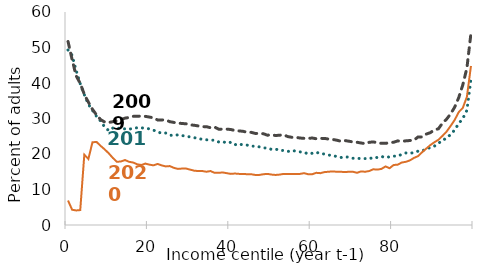
| Category | 2019 | 2009 | 2020 |
|---|---|---|---|
| 0.0 | 49.3 | 51.7 | 6.9 |
| 1.0 | 47.8 | 46.6 | 4.3 |
| 2.0 | 43.5 | 42 | 4.1 |
| 3.0 | 39.8 | 39.9 | 4.2 |
| 4.0 | 36.7 | 36.8 | 19.8 |
| 5.0 | 34 | 34.6 | 18.6 |
| 6.0 | 32.3 | 32.6 | 23.3 |
| 7.0 | 30.6 | 31 | 23.4 |
| 8.0 | 29.3 | 29.7 | 22.3 |
| 9.0 | 27.6 | 29 | 21.3 |
| 10.0 | 26.6 | 28.9 | 20.2 |
| 11.0 | 27.3 | 29.1 | 18.9 |
| 12.0 | 27.4 | 29.4 | 17.8 |
| 13.0 | 27 | 29.7 | 17.9 |
| 14.0 | 27.1 | 30.1 | 18.3 |
| 15.0 | 27 | 30.3 | 17.8 |
| 16.0 | 27.2 | 30.6 | 17.6 |
| 17.0 | 27.4 | 30.6 | 17.1 |
| 18.0 | 27.4 | 30.7 | 16.9 |
| 19.0 | 27.2 | 30.6 | 17.3 |
| 20.0 | 27.1 | 30.4 | 17 |
| 21.0 | 26.7 | 30.2 | 16.8 |
| 22.0 | 26.3 | 29.6 | 17.2 |
| 23.0 | 25.8 | 29.6 | 16.8 |
| 24.0 | 25.9 | 29.6 | 16.5 |
| 25.0 | 25.3 | 29.1 | 16.6 |
| 26.0 | 25.2 | 28.9 | 16.1 |
| 27.0 | 25.4 | 28.7 | 15.8 |
| 28.0 | 25.2 | 28.6 | 15.9 |
| 29.0 | 25 | 28.5 | 15.9 |
| 30.0 | 24.8 | 28.2 | 15.6 |
| 31.0 | 24.6 | 28.1 | 15.3 |
| 32.0 | 24.4 | 27.9 | 15.2 |
| 33.0 | 24.1 | 27.7 | 15.2 |
| 34.0 | 24 | 27.7 | 15 |
| 35.0 | 23.9 | 27.4 | 15.2 |
| 36.0 | 23.9 | 27.6 | 14.7 |
| 37.0 | 23.4 | 27 | 14.7 |
| 38.0 | 23.5 | 27 | 14.8 |
| 39.0 | 23.1 | 27 | 14.6 |
| 40.0 | 23.3 | 26.9 | 14.4 |
| 41.0 | 22.6 | 26.6 | 14.5 |
| 42.0 | 22.9 | 26.5 | 14.4 |
| 43.0 | 22.5 | 26.4 | 14.4 |
| 44.0 | 22.5 | 26.1 | 14.3 |
| 45.0 | 22.2 | 26.1 | 14.3 |
| 46.0 | 22.2 | 25.8 | 14.1 |
| 47.0 | 22 | 25.8 | 14.1 |
| 48.0 | 21.7 | 25.7 | 14.3 |
| 49.0 | 21.7 | 25.3 | 14.4 |
| 50.0 | 21.3 | 25.4 | 14.2 |
| 51.0 | 21.4 | 25.2 | 14.1 |
| 52.0 | 21 | 25.3 | 14.2 |
| 53.0 | 21 | 25.4 | 14.4 |
| 54.0 | 20.7 | 24.9 | 14.4 |
| 55.0 | 21 | 24.7 | 14.4 |
| 56.0 | 20.8 | 24.7 | 14.4 |
| 57.0 | 20.6 | 24.5 | 14.4 |
| 58.0 | 20.5 | 24.4 | 14.6 |
| 59.0 | 20 | 24.4 | 14.3 |
| 60.0 | 20.2 | 24.5 | 14.3 |
| 61.0 | 20.5 | 24.3 | 14.7 |
| 62.0 | 20.1 | 24.4 | 14.6 |
| 63.0 | 20 | 24.4 | 14.9 |
| 64.0 | 19.7 | 24.2 | 15 |
| 65.0 | 19.6 | 24.1 | 15.1 |
| 66.0 | 19.3 | 23.9 | 15 |
| 67.0 | 19 | 23.6 | 15 |
| 68.0 | 19.2 | 23.8 | 14.9 |
| 69.0 | 19.1 | 23.6 | 15 |
| 70.0 | 18.8 | 23.4 | 15 |
| 71.0 | 18.8 | 23.3 | 14.7 |
| 72.0 | 18.7 | 23.1 | 15.1 |
| 73.0 | 18.7 | 22.9 | 15 |
| 74.0 | 18.6 | 23.3 | 15.2 |
| 75.0 | 19.1 | 23.4 | 15.7 |
| 76.0 | 19 | 23.2 | 15.6 |
| 77.0 | 19.3 | 23 | 15.8 |
| 78.0 | 19 | 23 | 16.5 |
| 79.0 | 19.2 | 23.2 | 16 |
| 80.0 | 19.4 | 23.3 | 16.9 |
| 81.0 | 19.4 | 23.7 | 17 |
| 82.0 | 19.9 | 23.6 | 17.6 |
| 83.0 | 20.3 | 23.7 | 17.8 |
| 84.0 | 20.2 | 23.8 | 18.2 |
| 85.0 | 20.4 | 23.9 | 18.9 |
| 86.0 | 20.8 | 24.8 | 19.4 |
| 87.0 | 21 | 24.8 | 20.5 |
| 88.0 | 21.2 | 25.6 | 21.5 |
| 89.0 | 21.9 | 26 | 22.5 |
| 90.0 | 22.2 | 26.8 | 23.3 |
| 91.0 | 23.1 | 27.1 | 24 |
| 92.0 | 23.6 | 28.7 | 25.1 |
| 93.0 | 24.7 | 29.8 | 26.3 |
| 94.0 | 25.4 | 31.3 | 27.9 |
| 95.0 | 26.8 | 33.2 | 29.6 |
| 96.0 | 28.6 | 35.9 | 31.8 |
| 97.0 | 30 | 39.5 | 33 |
| 98.0 | 32.3 | 44.2 | 36.1 |
| 99.0 | 41.1 | 54 | 44.8 |